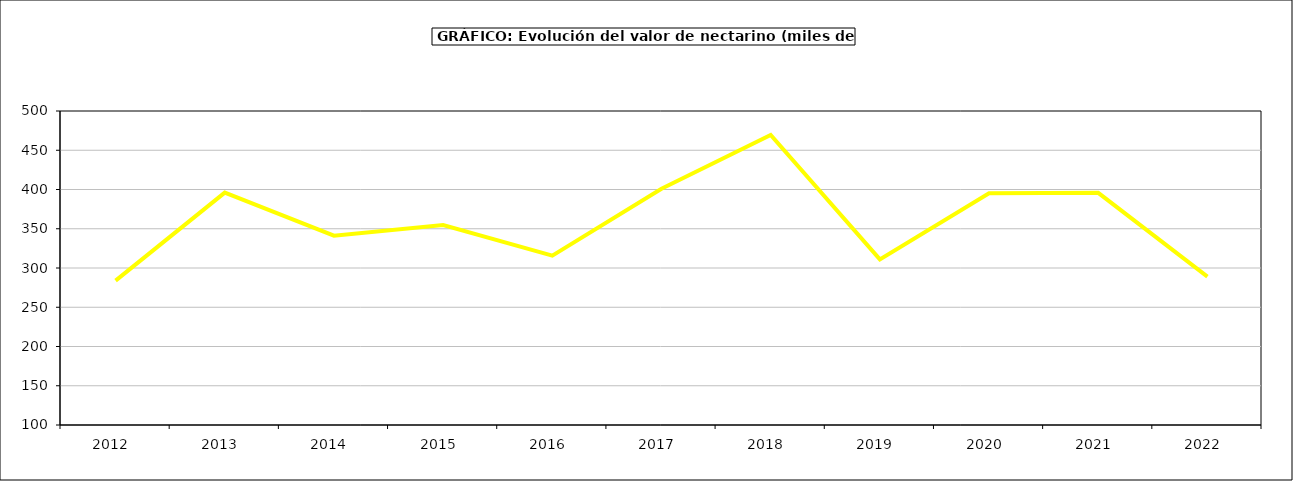
| Category | valor melocotonero |
|---|---|
| 2012.0 | 283.963 |
| 2013.0 | 395.996 |
| 2014.0 | 341.206 |
| 2015.0 | 354.8 |
| 2016.0 | 315.7 |
| 2017.0 | 400.939 |
| 2018.0 | 469.428 |
| 2019.0 | 310.904 |
| 2020.0 | 395.161 |
| 2021.0 | 395.777 |
| 2022.0 | 288.992 |